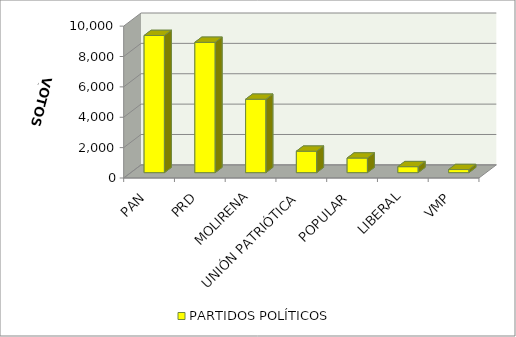
| Category | PARTIDOS POLÍTICOS |
|---|---|
| PAN | 9031 |
| PRD | 8581 |
| MOLIRENA | 4832 |
| UNIÓN PATRIÓTICA | 1411 |
| POPULAR | 961 |
| LIBERAL | 393 |
| VMP | 203 |